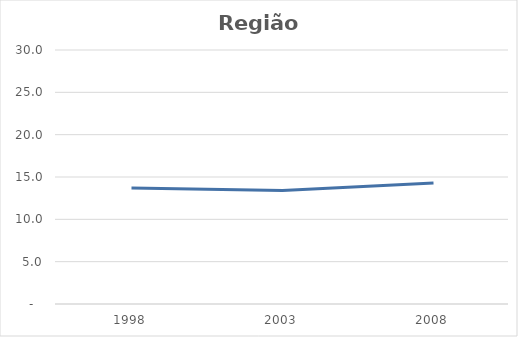
| Category | Região Nordeste |
|---|---|
| 1998.0 | 13.7 |
| 2003.0 | 13.4 |
| 2008.0 | 14.3 |